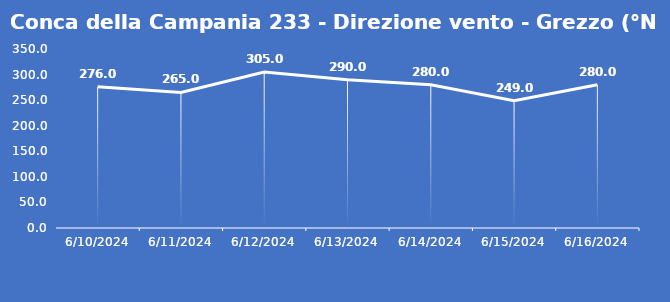
| Category | Conca della Campania 233 - Direzione vento - Grezzo (°N) |
|---|---|
| 6/10/24 | 276 |
| 6/11/24 | 265 |
| 6/12/24 | 305 |
| 6/13/24 | 290 |
| 6/14/24 | 280 |
| 6/15/24 | 249 |
| 6/16/24 | 280 |